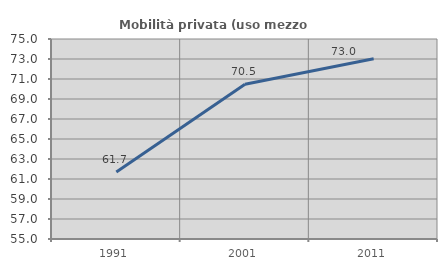
| Category | Mobilità privata (uso mezzo privato) |
|---|---|
| 1991.0 | 61.703 |
| 2001.0 | 70.478 |
| 2011.0 | 73.03 |